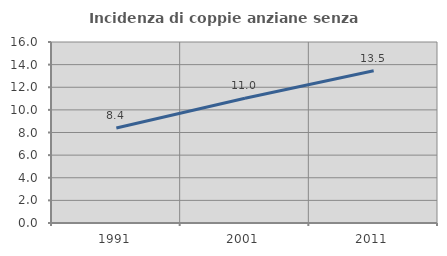
| Category | Incidenza di coppie anziane senza figli  |
|---|---|
| 1991.0 | 8.392 |
| 2001.0 | 11.032 |
| 2011.0 | 13.456 |